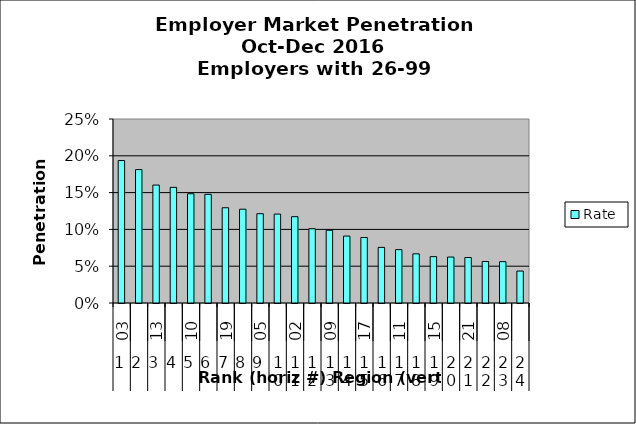
| Category | Rate |
|---|---|
| 0 | 0.194 |
| 1 | 0.181 |
| 2 | 0.16 |
| 3 | 0.157 |
| 4 | 0.148 |
| 5 | 0.148 |
| 6 | 0.129 |
| 7 | 0.127 |
| 8 | 0.121 |
| 9 | 0.121 |
| 10 | 0.117 |
| 11 | 0.101 |
| 12 | 0.099 |
| 13 | 0.091 |
| 14 | 0.089 |
| 15 | 0.076 |
| 16 | 0.073 |
| 17 | 0.067 |
| 18 | 0.063 |
| 19 | 0.062 |
| 20 | 0.062 |
| 21 | 0.056 |
| 22 | 0.056 |
| 23 | 0.043 |